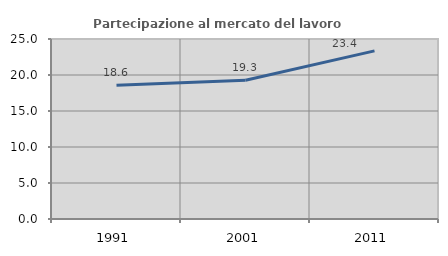
| Category | Partecipazione al mercato del lavoro  femminile |
|---|---|
| 1991.0 | 18.561 |
| 2001.0 | 19.283 |
| 2011.0 | 23.35 |